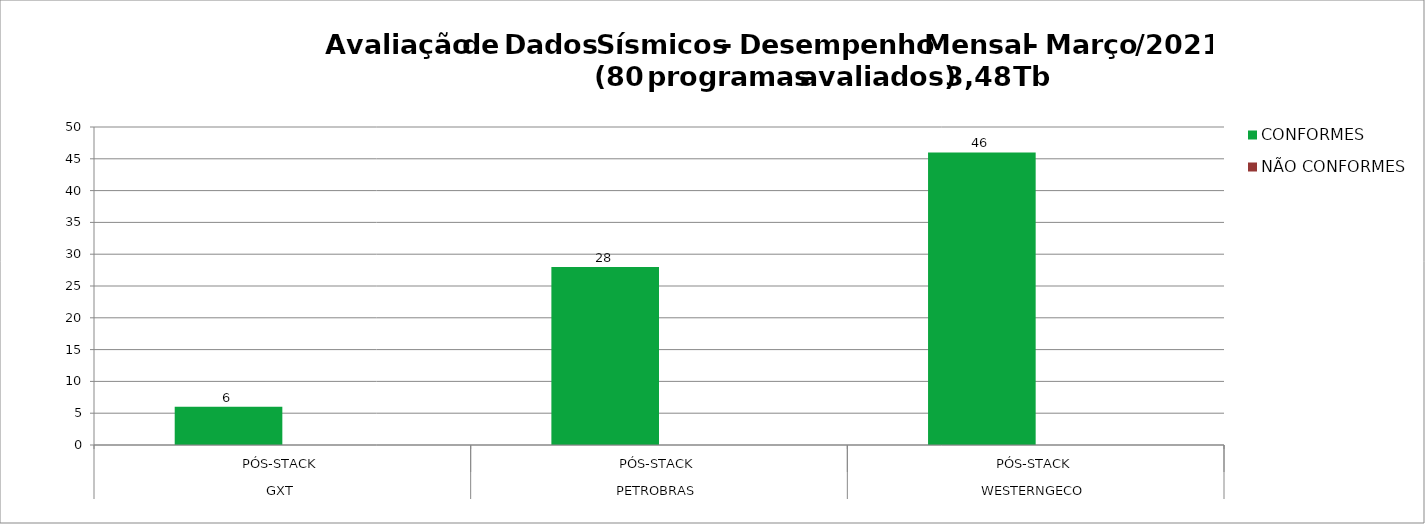
| Category | CONFORMES | NÃO CONFORMES |
|---|---|---|
| 0 | 6 |  |
| 1 | 28 |  |
| 2 | 46 |  |